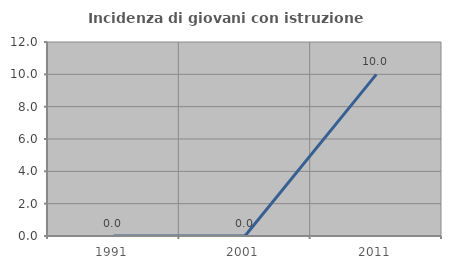
| Category | Incidenza di giovani con istruzione universitaria |
|---|---|
| 1991.0 | 0 |
| 2001.0 | 0 |
| 2011.0 | 10 |